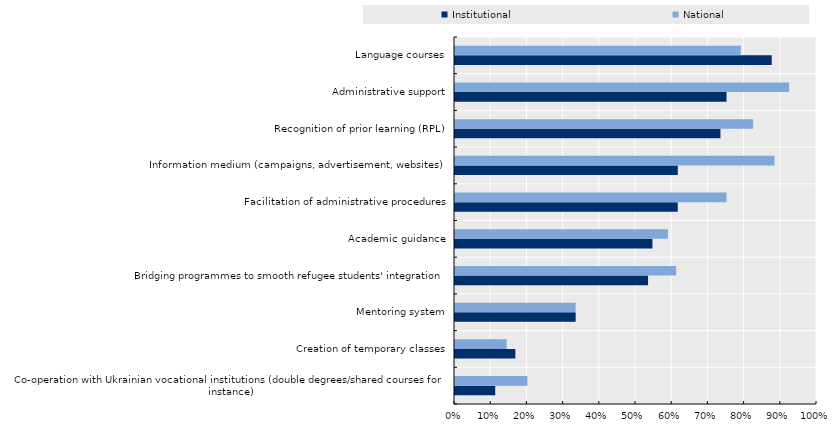
| Category | Institutional | National |
|---|---|---|
| Co-operation with Ukrainian vocational institutions (double degrees/shared courses for instance) | 0.111 | 0.2 |
| Creation of temporary classes | 0.167 | 0.143 |
| Mentoring system | 0.333 | 0.333 |
| Bridging programmes to smooth refugee students' integration | 0.533 | 0.611 |
| Academic guidance | 0.545 | 0.588 |
| Facilitation of administrative procedures | 0.615 | 0.75 |
| Information medium (campaigns, advertisement, websites) | 0.615 | 0.882 |
| Recognition of prior learning (RPL) | 0.733 | 0.824 |
| Administrative support | 0.75 | 0.923 |
| Language courses | 0.875 | 0.789 |